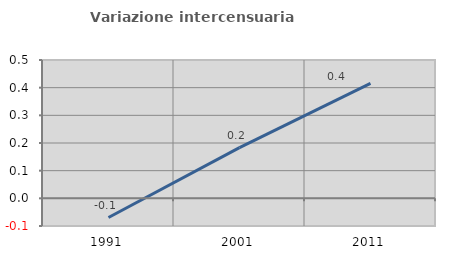
| Category | Variazione intercensuaria annua |
|---|---|
| 1991.0 | -0.069 |
| 2001.0 | 0.183 |
| 2011.0 | 0.415 |